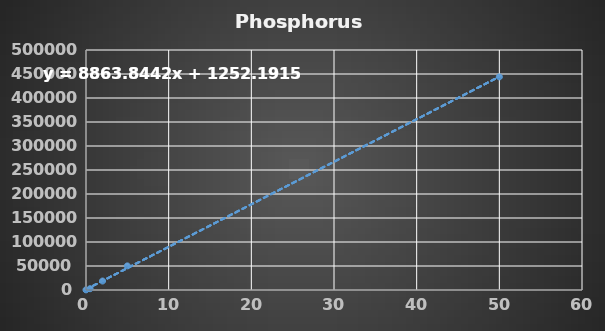
| Category | Phosphorus  |
|---|---|
| 0.0 | 276 |
| 0.5 | 2728 |
| 2.0 | 18705 |
| 5.0 | 50201 |
| 50.0 | 444022 |